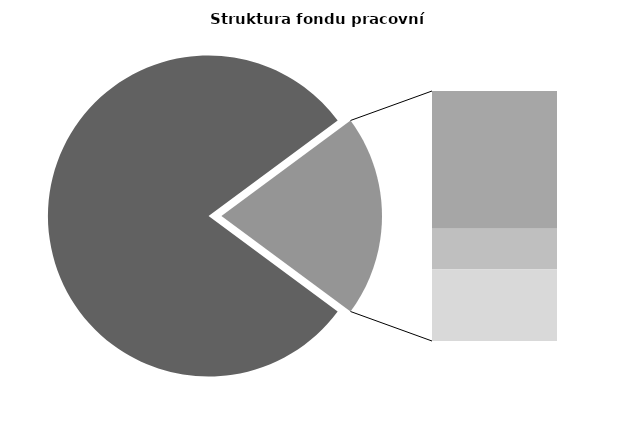
| Category | Series 0 |
|---|---|
| Průměrná měsíční odpracovaná doba bez přesčasu | 137.783 |
| Dovolená | 19.31 |
| Nemoc | 5.679 |
| Jiné | 10.054 |